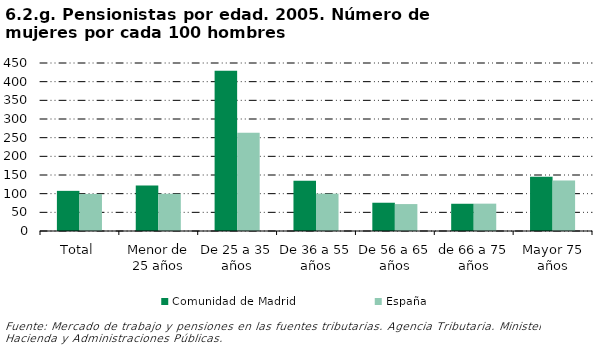
| Category | Comunidad de Madrid | España |
|---|---|---|
| Total | 107.516 | 99.313 |
| Menor de 25 años | 121.692 | 99.666 |
| De 25 a 35 años | 429.033 | 263.067 |
| De 36 a 55 años | 134.319 | 100.066 |
| De 56 a 65 años | 75.713 | 72.092 |
| de 66 a 75 años | 72.967 | 73.26 |
| Mayor 75 años | 145.442 | 135.276 |